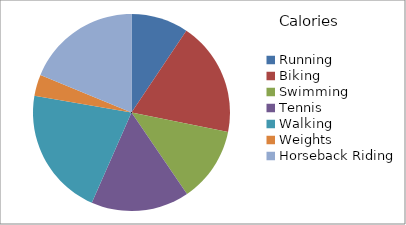
| Category | Series 0 |
|---|---|
| Running | 544.5 |
| Biking | 1088 |
| Swimming | 714 |
| Tennis | 935 |
| Walking | 1224 |
| Weights | 204 |
| Horseback Riding | 1088 |